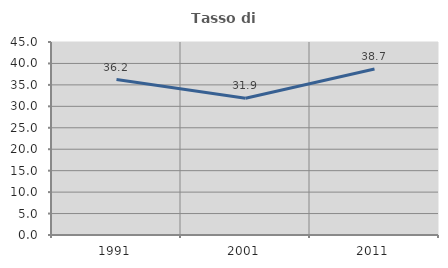
| Category | Tasso di occupazione   |
|---|---|
| 1991.0 | 36.236 |
| 2001.0 | 31.892 |
| 2011.0 | 38.699 |